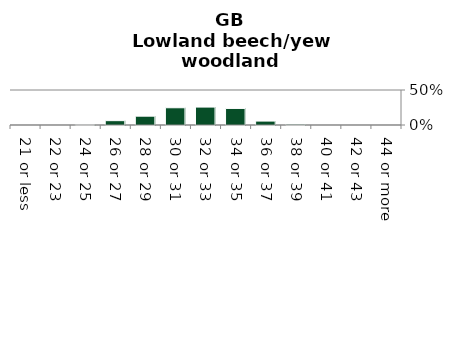
| Category | Lowland beech/yew woodland |
|---|---|
| 21 or less | 0 |
| 22 or 23 | 0 |
| 24 or 25 | 0.005 |
| 26 or 27 | 0.062 |
| 28 or 29 | 0.126 |
| 30 or 31 | 0.246 |
| 32 or 33 | 0.256 |
| 34 or 35 | 0.237 |
| 36 or 37 | 0.056 |
| 38 or 39 | 0.012 |
| 40 or 41 | 0 |
| 42 or 43 | 0 |
| 44 or more | 0 |